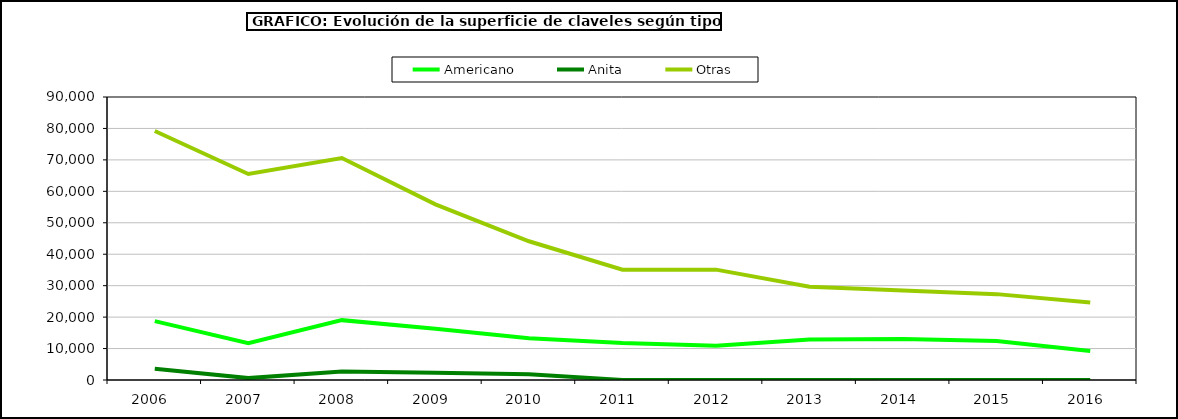
| Category | Americano | Anita | Otras |
|---|---|---|---|
| 2006.0 | 18707 | 3575 | 79191 |
| 2007.0 | 11725 | 600 | 65511 |
| 2008.0 | 19035 | 2700 | 70575 |
| 2009.0 | 16320 | 2300 | 55861 |
| 2010.0 | 13273 | 1800 | 44126 |
| 2011.0 | 11730 | 30 | 35100 |
| 2012.0 | 10894 | 0 | 35100 |
| 2013.0 | 12913 | 0 | 29659 |
| 2014.0 | 13022 | 0 | 28479 |
| 2015.0 | 12405 | 0 | 27308 |
| 2016.0 | 9252 | 0 | 24628 |